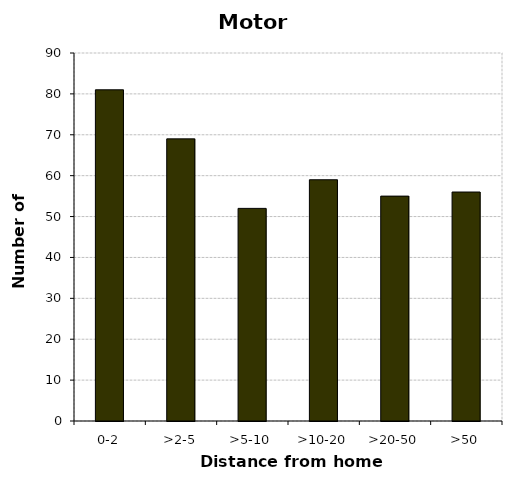
| Category | Motorcycles |
|---|---|
| 0-2 | 81 |
| >2-5 | 69 |
| >5-10 | 52 |
| >10-20 | 59 |
| >20-50 | 55 |
| >50 | 56 |